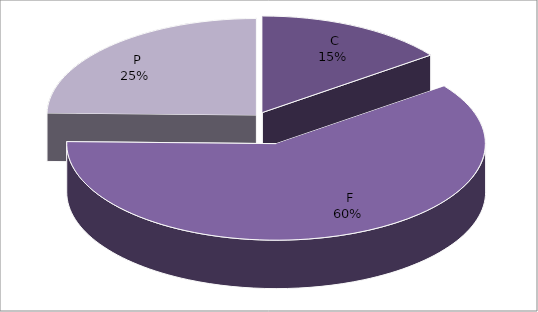
| Category | Series 0 |
|---|---|
|  C | 846 |
|  F | 3446 |
|  P | 1405 |